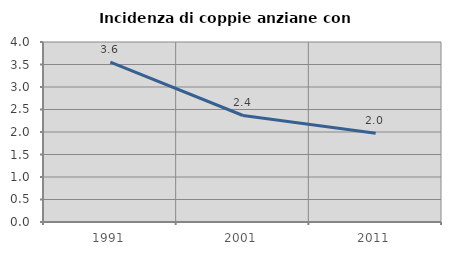
| Category | Incidenza di coppie anziane con figli |
|---|---|
| 1991.0 | 3.553 |
| 2001.0 | 2.367 |
| 2011.0 | 1.974 |